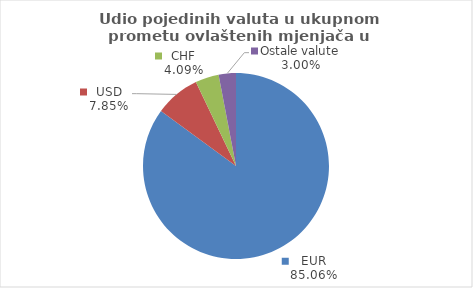
| Category | Series 0 |
|---|---|
| EUR | 85.056 |
| USD | 7.851 |
| CHF | 4.091 |
| Ostale valute | 3.003 |